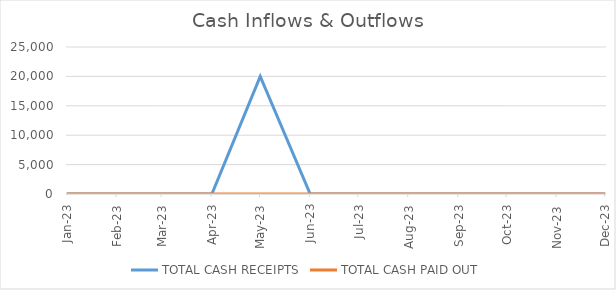
| Category | TOTAL CASH RECEIPTS | TOTAL CASH PAID OUT |
|---|---|---|
| 2023-01-01 | 0 | 0 |
| 2023-02-01 | 0 | 0 |
| 2023-03-01 | 0 | 0 |
| 2023-04-01 | 0 | 0 |
| 2023-05-01 | 20000 | 0 |
| 2023-06-01 | 0 | 0 |
| 2023-07-01 | 0 | 0 |
| 2023-08-01 | 0 | 0 |
| 2023-09-01 | 0 | 0 |
| 2023-10-01 | 0 | 0 |
| 2023-11-01 | 0 | 0 |
| 2023-12-01 | 0 | 0 |